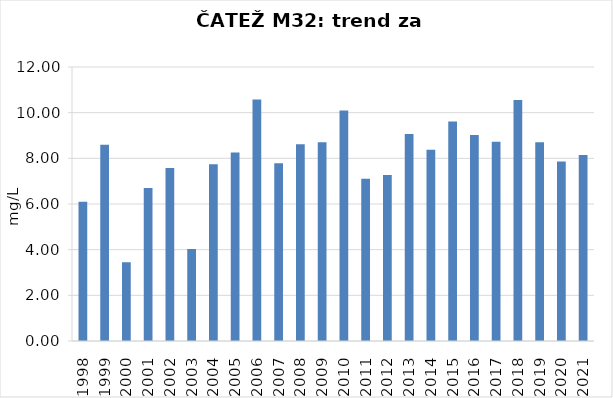
| Category | Vsota |
|---|---|
| 1998 | 6.1 |
| 1999 | 8.6 |
| 2000 | 3.45 |
| 2001 | 6.7 |
| 2002 | 7.58 |
| 2003 | 4.025 |
| 2004 | 7.74 |
| 2005 | 8.255 |
| 2006 | 10.58 |
| 2007 | 7.785 |
| 2008 | 8.62 |
| 2009 | 8.705 |
| 2010 | 10.1 |
| 2011 | 7.105 |
| 2012 | 7.275 |
| 2013 | 9.07 |
| 2014 | 8.38 |
| 2015 | 9.61 |
| 2016 | 9.02 |
| 2017 | 8.73 |
| 2018 | 10.55 |
| 2019 | 8.7 |
| 2020 | 7.86 |
| 2021 | 8.15 |